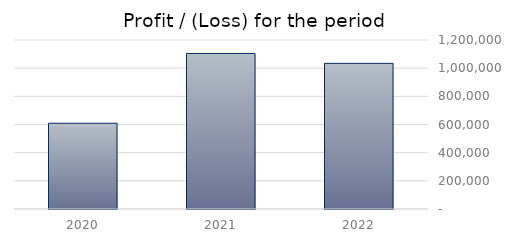
| Category | Profit / (Loss) for the period |
|---|---|
| 2022.0 | 1034069 |
| 2021.0 | 1104667 |
| 2020.0 | 608918 |